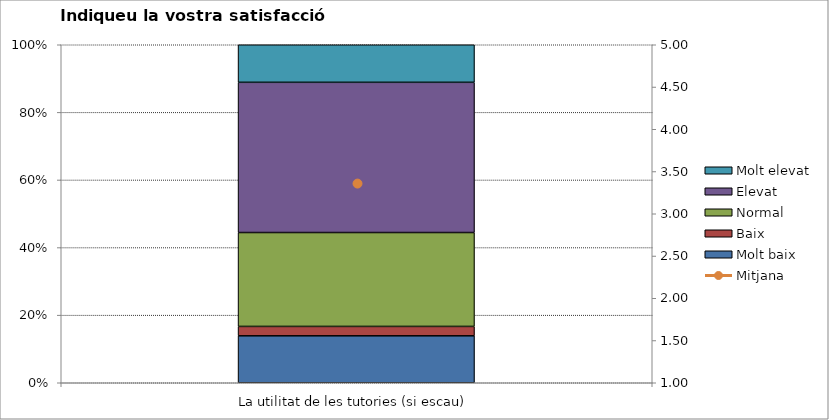
| Category | Molt baix | Baix | Normal  | Elevat | Molt elevat |
|---|---|---|---|---|---|
| La utilitat de les tutories (si escau) | 5 | 1 | 10 | 16 | 4 |